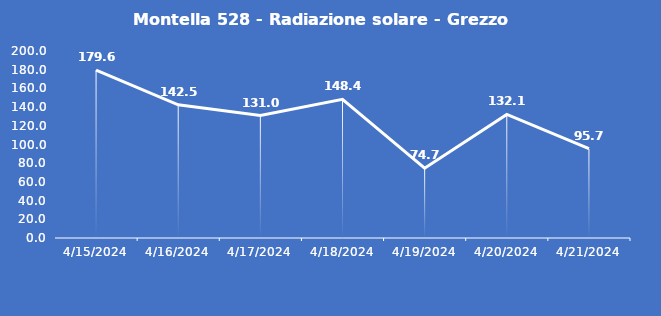
| Category | Montella 528 - Radiazione solare - Grezzo (W/m2) |
|---|---|
| 4/15/24 | 179.6 |
| 4/16/24 | 142.5 |
| 4/17/24 | 131 |
| 4/18/24 | 148.4 |
| 4/19/24 | 74.7 |
| 4/20/24 | 132.1 |
| 4/21/24 | 95.7 |